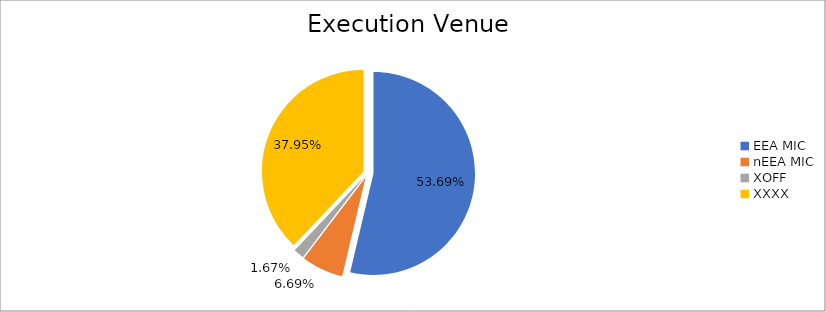
| Category | Series 0 |
|---|---|
| EEA MIC | 6748878.576 |
| nEEA MIC | 840388.153 |
| XOFF | 210450.827 |
| XXXX | 4770104.472 |